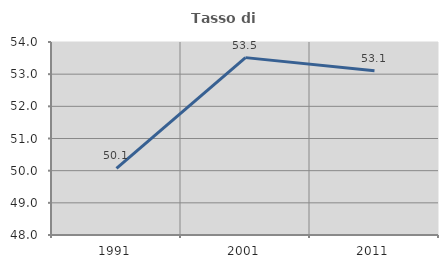
| Category | Tasso di occupazione   |
|---|---|
| 1991.0 | 50.07 |
| 2001.0 | 53.514 |
| 2011.0 | 53.106 |